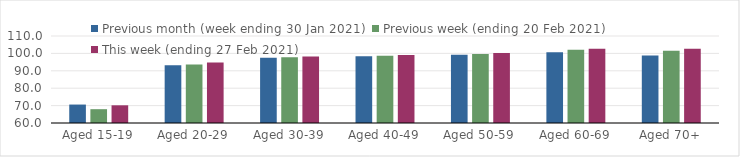
| Category | Previous month (week ending 30 Jan 2021) | Previous week (ending 20 Feb 2021) | This week (ending 27 Feb 2021) |
|---|---|---|---|
| Aged 15-19 | 70.6 | 67.94 | 70.17 |
| Aged 20-29 | 93.17 | 93.69 | 94.74 |
| Aged 30-39 | 97.52 | 97.79 | 98.28 |
| Aged 40-49 | 98.39 | 98.64 | 99.1 |
| Aged 50-59 | 99.19 | 99.62 | 100.18 |
| Aged 60-69 | 100.59 | 102.03 | 102.66 |
| Aged 70+ | 98.8 | 101.56 | 102.62 |